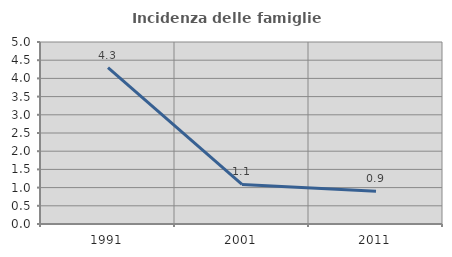
| Category | Incidenza delle famiglie numerose |
|---|---|
| 1991.0 | 4.298 |
| 2001.0 | 1.087 |
| 2011.0 | 0.901 |